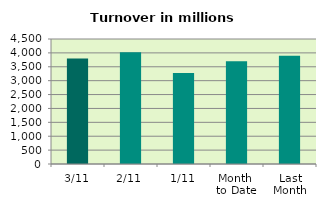
| Category | Series 0 |
|---|---|
| 3/11 | 3797.837 |
| 2/11 | 4023.998 |
| 1/11 | 3274.714 |
| Month 
to Date | 3698.85 |
| Last
Month | 3895.685 |